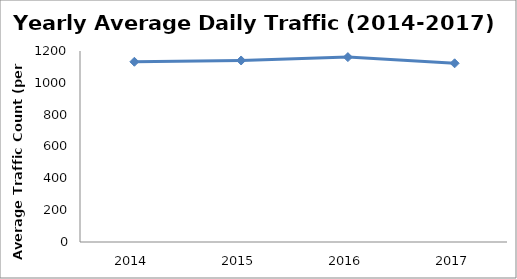
| Category | Series 0 |
|---|---|
| 2014.0 | 1132.266 |
| 2015.0 | 1140.507 |
| 2016.0 | 1161.607 |
| 2017.0 | 1122.655 |